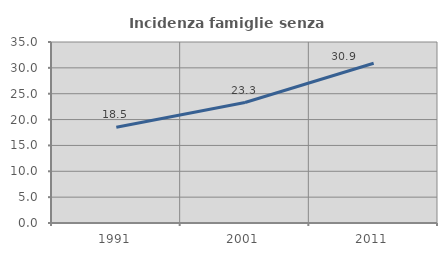
| Category | Incidenza famiglie senza nuclei |
|---|---|
| 1991.0 | 18.516 |
| 2001.0 | 23.291 |
| 2011.0 | 30.88 |